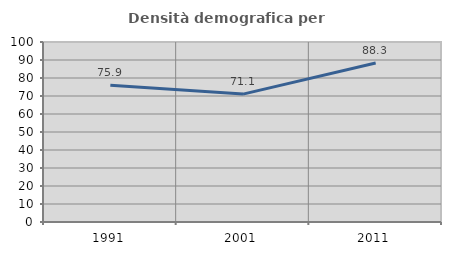
| Category | Densità demografica |
|---|---|
| 1991.0 | 75.944 |
| 2001.0 | 71.052 |
| 2011.0 | 88.29 |